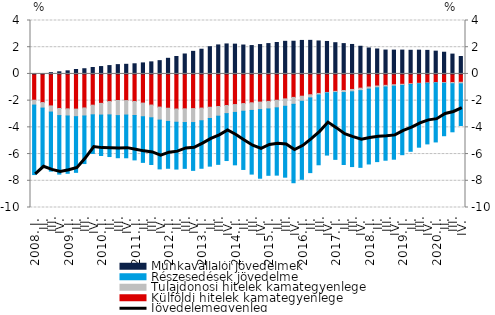
| Category | Külföldi hitelek kamategyenlege | Tulajdonosi hitelek kamategyenlege | Részesedések jövedelme  | Munkavállalói jövedelmek |
|---|---|---|---|---|
| 2008. I. | -1.967 | -0.366 | -5.202 | 0.012 |
|          II. | -2.145 | -0.413 | -4.427 | 0.032 |
|          III. | -2.396 | -0.458 | -4.421 | 0.095 |
|          IV. | -2.588 | -0.531 | -4.379 | 0.159 |
| 2009. I. | -2.615 | -0.533 | -4.292 | 0.232 |
|          II. | -2.635 | -0.565 | -4.169 | 0.331 |
|          III. | -2.547 | -0.601 | -3.561 | 0.389 |
|          IV. | -2.34 | -0.723 | -2.893 | 0.481 |
| 2010. I. | -2.204 | -0.877 | -3.025 | 0.551 |
|          II. | -2.068 | -1 | -3.117 | 0.625 |
|          III. | -1.99 | -1.131 | -3.153 | 0.697 |
|          IV. | -1.995 | -1.083 | -3.198 | 0.721 |
| 2011. I. | -2.065 | -1.048 | -3.323 | 0.76 |
|          II. | -2.184 | -1.021 | -3.417 | 0.825 |
|          III. | -2.33 | -0.955 | -3.498 | 0.903 |
|          IV. | -2.483 | -0.975 | -3.652 | 0.994 |
| 2012. I. | -2.569 | -0.99 | -3.504 | 1.169 |
|          II. | -2.627 | -0.991 | -3.505 | 1.305 |
|          III. | -2.613 | -1.027 | -3.43 | 1.493 |
|          IV. | -2.596 | -1.044 | -3.58 | 1.69 |
| 2013. I. | -2.557 | -0.95 | -3.555 | 1.849 |
| II. | -2.495 | -0.841 | -3.568 | 2.038 |
|          III. | -2.439 | -0.726 | -3.606 | 2.171 |
| IV. | -2.364 | -0.608 | -3.512 | 2.246 |
| 2014. I. | -2.294 | -0.587 | -3.924 | 2.23 |
| II. | -2.22 | -0.575 | -4.357 | 2.164 |
|          III. | -2.162 | -0.571 | -4.767 | 2.124 |
| IV. | -2.107 | -0.562 | -5.138 | 2.199 |
| 2015. I. | -2.055 | -0.565 | -4.969 | 2.272 |
| II. | -1.971 | -0.567 | -5.038 | 2.353 |
|          III. | -1.868 | -0.555 | -5.308 | 2.441 |
| IV. | -1.758 | -0.517 | -5.871 | 2.448 |
| 2016. I. | -1.667 | -0.381 | -5.841 | 2.508 |
| II. | -1.559 | -0.235 | -5.594 | 2.513 |
|          III. | -1.459 | -0.118 | -5.224 | 2.468 |
| IV. | -1.387 | -0.041 | -4.647 | 2.43 |
| 2017. I. | -1.303 | -0.092 | -5.001 | 2.338 |
| II. | -1.24 | -0.155 | -5.387 | 2.27 |
|          III. | -1.162 | -0.177 | -5.597 | 2.206 |
| IV. | -1.068 | -0.185 | -5.74 | 2.071 |
| 2018. I. | -0.979 | -0.157 | -5.605 | 1.942 |
| II. | -0.905 | -0.131 | -5.528 | 1.867 |
|          III. | -0.855 | -0.122 | -5.484 | 1.787 |
| IV. | -0.807 | -0.111 | -5.467 | 1.783 |
| 2019. I. | -0.775 | -0.089 | -5.183 | 1.784 |
| II. | -0.731 | -0.059 | -5.002 | 1.77 |
|          III. | -0.701 | -0.035 | -4.749 | 1.78 |
| IV. | -0.672 | -0.026 | -4.54 | 1.763 |
| 2020. I. | -0.642 | -0.03 | -4.42 | 1.705 |
| II. | -0.649 | -0.054 | -3.924 | 1.625 |
|          III. | -0.642 | -0.093 | -3.596 | 1.485 |
| IV. | -0.625 | -0.115 | -3.12 | 1.303 |